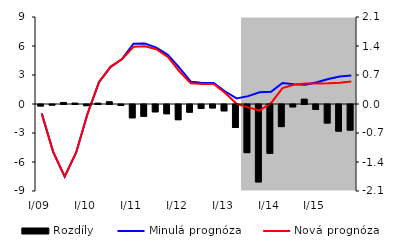
| Category | Rozdíly |
|---|---|
| 0 | -0.035 |
| 1 | -0.014 |
| 2 | 0.037 |
| 3 | 0.023 |
| 4 | -0.028 |
| 5 | 0.021 |
| 6 | 0.056 |
| 7 | -0.022 |
| 8 | -0.321 |
| 9 | -0.285 |
| 10 | -0.176 |
| 11 | -0.223 |
| 12 | -0.366 |
| 13 | -0.184 |
| 14 | -0.094 |
| 15 | -0.082 |
| 16 | -0.153 |
| 17 | -0.555 |
| 18 | -1.162 |
| 19 | -1.868 |
| 20 | -1.179 |
| 21 | -0.533 |
| 22 | -0.056 |
| 23 | 0.118 |
| 24 | -0.118 |
| 25 | -0.446 |
| 26 | -0.642 |
| 27 | -0.616 |